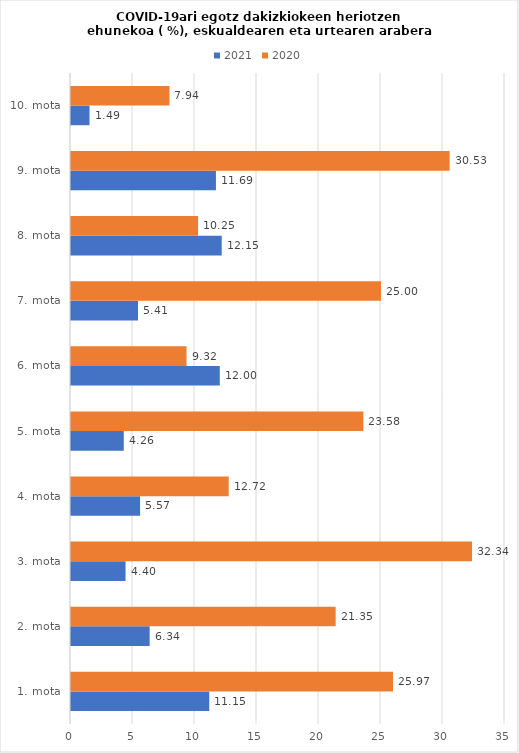
| Category | 2021 | 2020 |
|---|---|---|
| 1. mota | 11.149 | 25.969 |
| 2. mota | 6.342 | 21.345 |
| 3. mota | 4.399 | 32.34 |
| 4. mota | 5.572 | 12.719 |
| 5. mota | 4.255 | 23.577 |
| 6. mota | 12 | 9.317 |
| 7. mota | 5.405 | 25 |
| 8. mota | 12.155 | 10.247 |
| 9. mota | 11.688 | 30.534 |
| 10. mota | 1.493 | 7.942 |